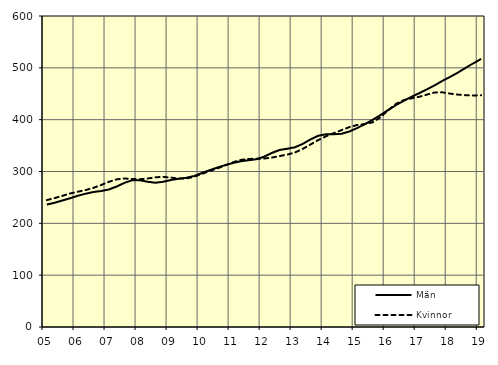
| Category | Män | Kvinnor |
|---|---|---|
| 5.0 | 236.18 | 244.84 |
| nan | 239.68 | 248.69 |
| 6.0 | 243.99 | 253.08 |
| 6.0 | 248.39 | 257.59 |
| 6.0 | 253.07 | 261.05 |
| nan | 257.26 | 264.18 |
| 7.0 | 260.29 | 268.44 |
| 7.0 | 262.45 | 273.95 |
| 7.0 | 265.41 | 280.09 |
| nan | 271.04 | 284.86 |
| 8.0 | 278.11 | 286.47 |
| 8.0 | 283.09 | 285.62 |
| 8.0 | 283.29 | 285.12 |
| nan | 280.43 | 286.44 |
| 9.0 | 278.35 | 288.83 |
| 9.0 | 280.11 | 289.65 |
| 9.0 | 283.76 | 288.23 |
| nan | 286.16 | 286.36 |
| 10.0 | 287.97 | 286.41 |
| 10.0 | 291.5 | 290.01 |
| 10.0 | 297.14 | 295.5 |
| nan | 302.76 | 300.79 |
| 11.0 | 307.73 | 306 |
| 11.0 | 312.32 | 311.85 |
| 11.0 | 316.56 | 317.87 |
| nan | 319.93 | 322.37 |
| 12.0 | 321.68 | 324.24 |
| 12.0 | 323.74 | 324.57 |
| 12.0 | 328.44 | 325.01 |
| nan | 335.63 | 326.82 |
| 13.0 | 341.53 | 329.76 |
| 13.0 | 344.1 | 332.6 |
| 13.0 | 346.84 | 336.72 |
| nan | 353.12 | 343.61 |
| 14.0 | 361.94 | 352.16 |
| 14.0 | 368.89 | 360.7 |
| 14.0 | 371.91 | 367.92 |
| nan | 372.05 | 373.99 |
| 15.0 | 373.01 | 379.8 |
| 15.0 | 377.22 | 385.6 |
| 15.0 | 383.73 | 389.65 |
| nan | 391.62 | 391.41 |
| 16.0 | 399.71 | 394.85 |
| 16.0 | 408.88 | 404.38 |
| 16.0 | 418.53 | 418.06 |
| nan | 427.81 | 430.29 |
| 17.0 | 436.47 | 437.59 |
| 17.0 | 444.03 | 441.1 |
| 17.0 | 450.93 | 444.05 |
| nan | 458.33 | 448.31 |
| 18.0 | 466.37 | 452.5 |
| 18.0 | 474.63 | 452.69 |
| 18.0 | 482.42 | 450.27 |
| nan | 490.72 | 448.37 |
| 19.0 | 499.79 | 447.22 |
| 19.0 | 508.83 | 446.62 |
| 19.0 | 517.25 | 447.06 |